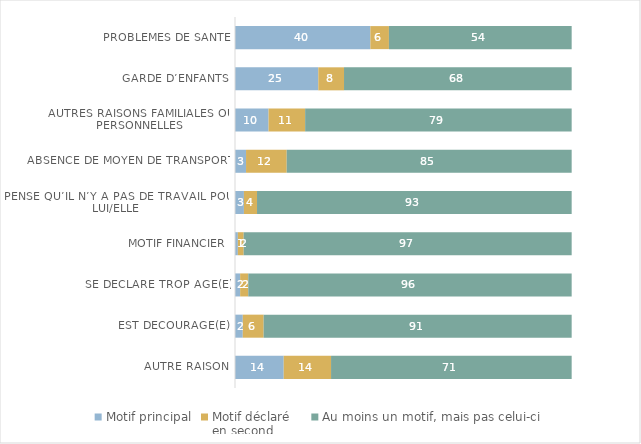
| Category | Motif principal | Motif déclaré 
en second | Au moins un motif, mais pas celui-ci |
|---|---|---|---|
| Problèmes de santé | 40.21 | 5.51 | 54.28 |
| Garde d’enfants | 24.74 | 7.64 | 67.62 |
| Autres raisons familiales ou personnelles | 9.97 | 10.86 | 79.17 |
| Absence de moyen de transport | 3.28 | 12.08 | 84.64 |
| Pense qu’il n’y a pas de travail pour lui/elle | 2.65 | 3.89 | 93.46 |
| Motif financier  | 0.85 | 1.73 | 97.42 |
| Se déclare trop âgé(e) | 1.53 | 2.41 | 96.06 |
| Est découragé(e) | 2.31 | 6.2 | 91.49 |
| Autre raison | 14.47 | 14.06 | 71.47 |